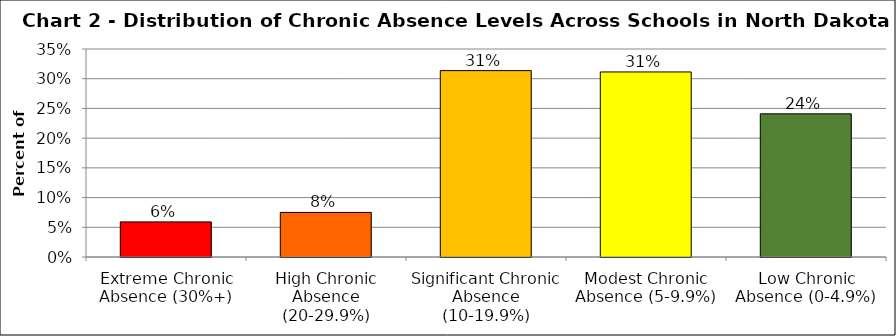
| Category | Series 1 |
|---|---|
| Extreme Chronic Absence (30%+) | 0.059 |
| High Chronic Absence (20-29.9%) | 0.075 |
| Significant Chronic Absence (10-19.9%) | 0.314 |
| Modest Chronic Absence (5-9.9%) | 0.311 |
| Low Chronic Absence (0-4.9%) | 0.241 |